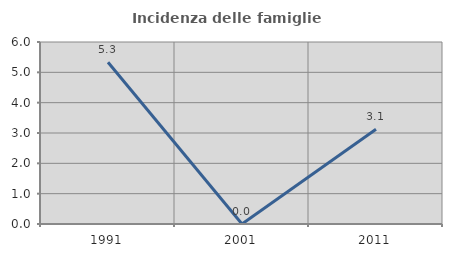
| Category | Incidenza delle famiglie numerose |
|---|---|
| 1991.0 | 5.333 |
| 2001.0 | 0 |
| 2011.0 | 3.125 |